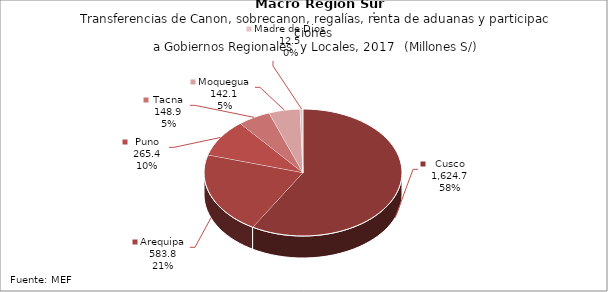
| Category | Series 0 |
|---|---|
| Cusco | 1624.655 |
| Arequipa | 583.785 |
| Puno | 265.418 |
| Tacna | 148.859 |
| Moquegua | 142.145 |
| Madre de Dios | 12.485 |